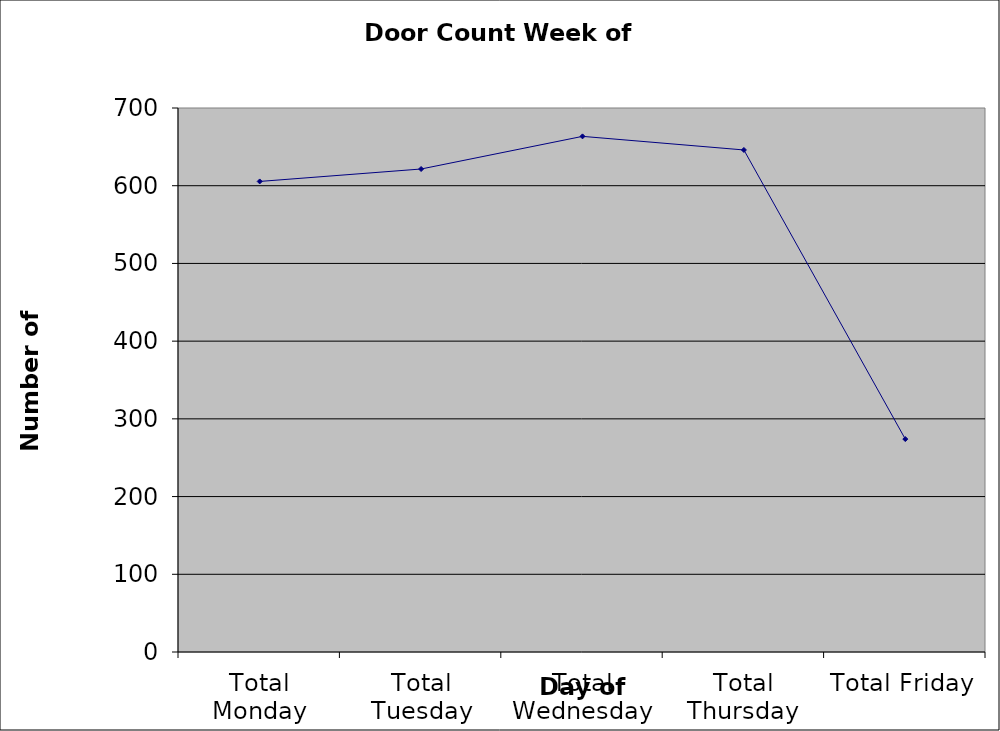
| Category | Series 0 |
|---|---|
| Total Monday | 605.5 |
| Total Tuesday | 621.5 |
| Total Wednesday | 663.5 |
| Total Thursday | 646 |
| Total Friday | 274 |